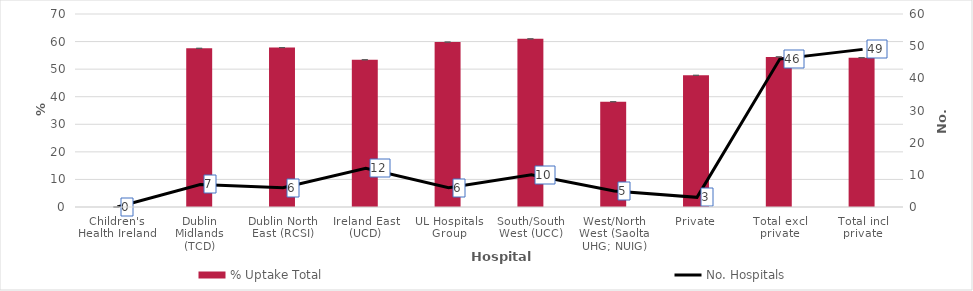
| Category | % Uptake Total  |
|---|---|
| Children's Health Ireland | 0 |
| Dublin Midlands (TCD) | 57.552 |
| Dublin North East (RCSI) | 57.812 |
| Ireland East (UCD) | 53.406 |
| UL Hospitals Group | 59.816 |
| South/South West (UCC) | 60.979 |
| West/North West (Saolta UHG; NUIG) | 38.183 |
| Private | 47.758 |
| Total excl private | 54.442 |
| Total incl private | 54.151 |